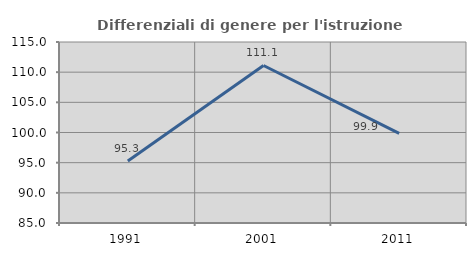
| Category | Differenziali di genere per l'istruzione superiore |
|---|---|
| 1991.0 | 95.284 |
| 2001.0 | 111.106 |
| 2011.0 | 99.856 |